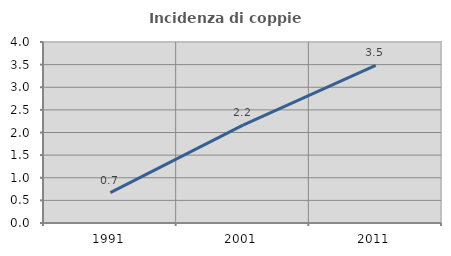
| Category | Incidenza di coppie miste |
|---|---|
| 1991.0 | 0.67 |
| 2001.0 | 2.163 |
| 2011.0 | 3.486 |